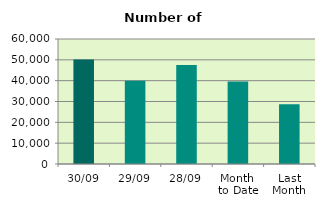
| Category | Series 0 |
|---|---|
| 30/09 | 50190 |
| 29/09 | 39910 |
| 28/09 | 47486 |
| Month 
to Date | 39557.091 |
| Last
Month | 28637.636 |